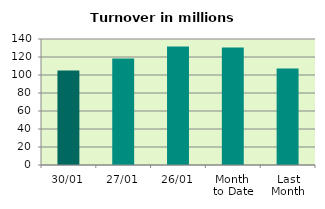
| Category | Series 0 |
|---|---|
| 30/01 | 105.058 |
| 27/01 | 118.306 |
| 26/01 | 131.802 |
| Month 
to Date | 130.421 |
| Last
Month | 107.094 |